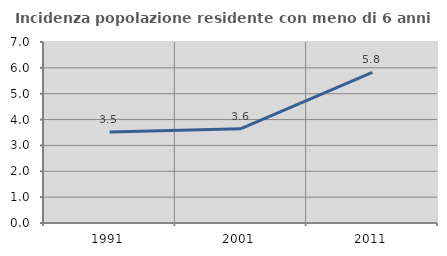
| Category | Incidenza popolazione residente con meno di 6 anni |
|---|---|
| 1991.0 | 3.52 |
| 2001.0 | 3.648 |
| 2011.0 | 5.827 |